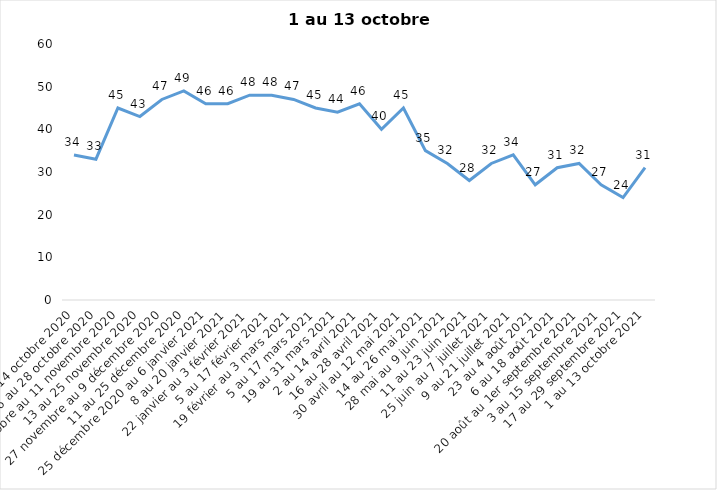
| Category | Toujours aux trois mesures |
|---|---|
| 2 au 14 octobre 2020 | 34 |
| 16 au 28 octobre 2020 | 33 |
| 30 octobre au 11 novembre 2020 | 45 |
| 13 au 25 novembre 2020 | 43 |
| 27 novembre au 9 décembre 2020 | 47 |
| 11 au 25 décembre 2020 | 49 |
| 25 décembre 2020 au 6 janvier 2021 | 46 |
| 8 au 20 janvier 2021 | 46 |
| 22 janvier au 3 février 2021 | 48 |
| 5 au 17 février 2021 | 48 |
| 19 février au 3 mars 2021 | 47 |
| 5 au 17 mars 2021 | 45 |
| 19 au 31 mars 2021 | 44 |
| 2 au 14 avril 2021 | 46 |
| 16 au 28 avril 2021 | 40 |
| 30 avril au 12 mai 2021 | 45 |
| 14 au 26 mai 2021 | 35 |
| 28 mai au 9 juin 2021 | 32 |
| 11 au 23 juin 2021 | 28 |
| 25 juin au 7 juillet 2021 | 32 |
| 9 au 21 juillet 2021 | 34 |
| 23 au 4 août 2021 | 27 |
| 6 au 18 août 2021 | 31 |
| 20 août au 1er septembre 2021 | 32 |
| 3 au 15 septembre 2021 | 27 |
| 17 au 29 septembre 2021 | 24 |
| 1 au 13 octobre 2021 | 31 |